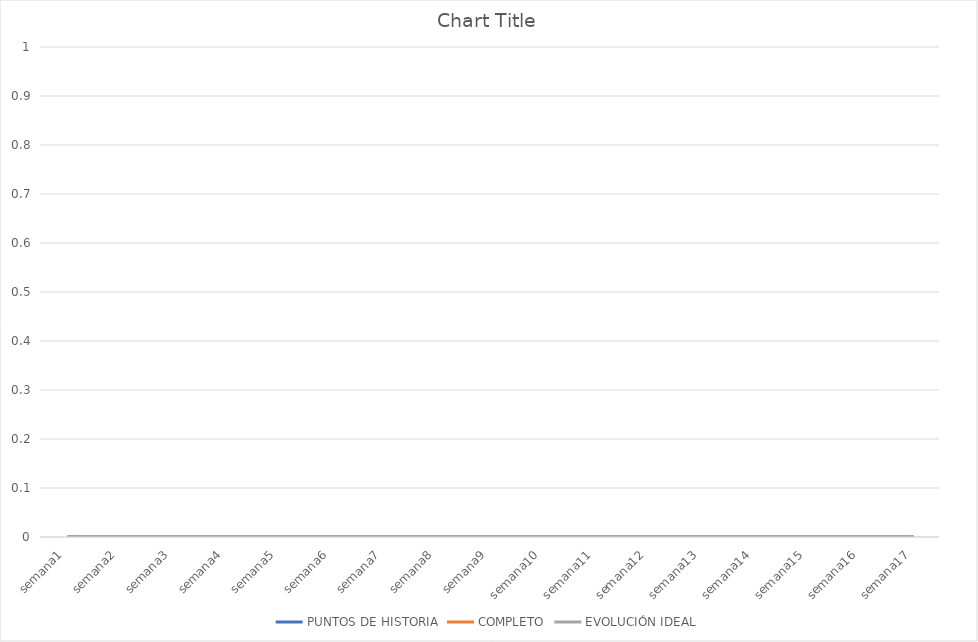
| Category | PUNTOS DE HISTORIA | COMPLETO | EVOLUCIÓN IDEAL |
|---|---|---|---|
| semana1 | 0 | 0 | 0 |
| semana2 | 0 | 0 | 0 |
| semana3 | 0 | 0 | 0 |
| semana4 | 0 | 0 | 0 |
| semana5 | 0 | 0 | 0 |
| semana6 | 0 | 0 | 0 |
| semana7 | 0 | 0 | 0 |
| semana8 | 0 | 0 | 0 |
| semana9 | 0 | 0 | 0 |
| semana10 | 0 | 0 | 0 |
| semana11 | 0 | 0 | 0 |
| semana12 | 0 | 0 | 0 |
| semana13 | 0 | 0 | 0 |
| semana14 | 0 | 0 | 0 |
| semana15 | 0 | 0 | 0 |
| semana16 | 0 | 0 | 0 |
| semana17 | 0 | 0 | 0 |